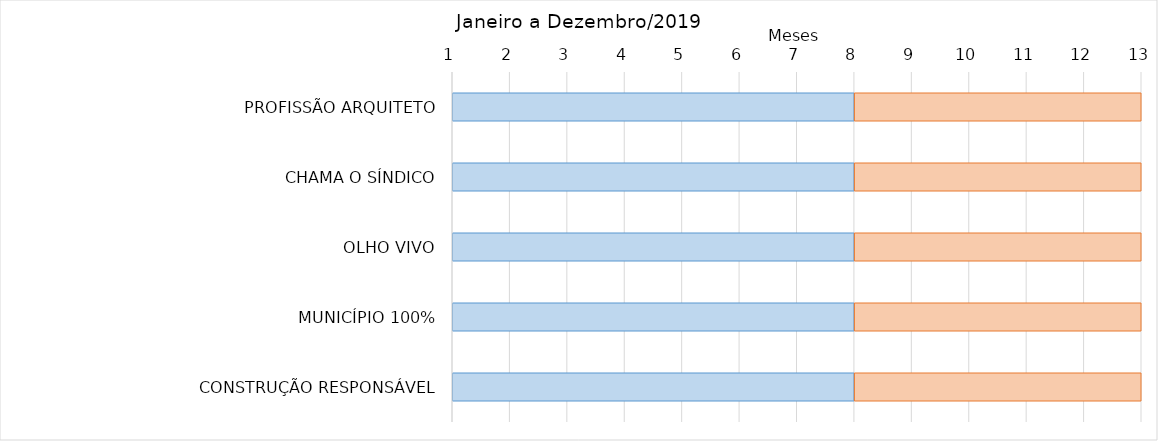
| Category | B Início | C Duração |
|---|---|---|
| PROFISSÃO ARQUITETO | 8 | 5 |
| CHAMA O SÍNDICO | 8 | 5 |
|  OLHO VIVO | 8 | 5 |
| MUNICÍPIO 100% | 8 | 5 |
| CONSTRUÇÃO RESPONSÁVEL | 8 | 5 |